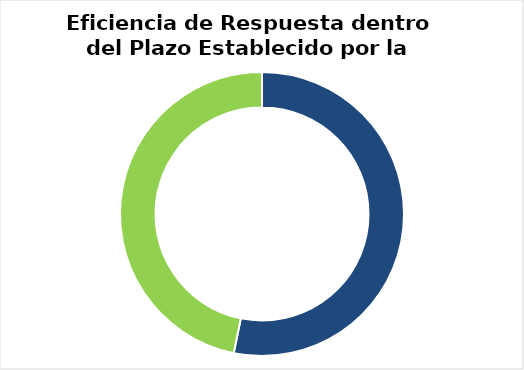
| Category | Series 0 |
|---|---|
| SOLICITUDES RECIBIDAS | 50 |
| RESPONDIDAS DENTRO DEL PLAZO | 44 |